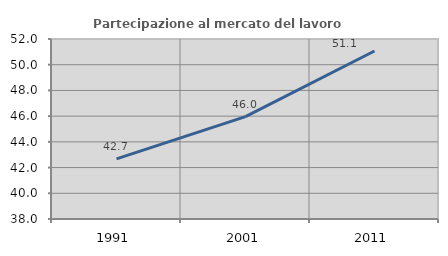
| Category | Partecipazione al mercato del lavoro  femminile |
|---|---|
| 1991.0 | 42.682 |
| 2001.0 | 45.962 |
| 2011.0 | 51.068 |